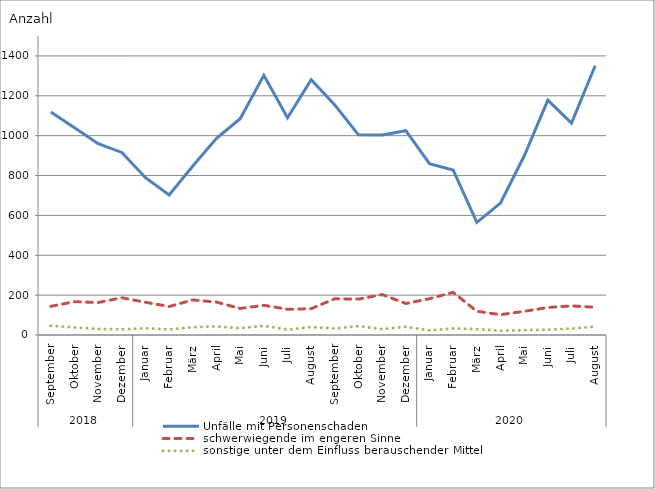
| Category | Unfälle mit Personenschaden | schwerwiegende im engeren Sinne | sonstige unter dem Einfluss berauschender Mittel |
|---|---|---|---|
| 0 | 1119 | 144 | 46 |
| 1 | 1040 | 167 | 38 |
| 2 | 960 | 163 | 30 |
| 3 | 916 | 187 | 28 |
| 4 | 789 | 164 | 34 |
| 5 | 702 | 143 | 28 |
| 6 | 848 | 176 | 39 |
| 7 | 987 | 165 | 43 |
| 8 | 1085 | 133 | 34 |
| 9 | 1303 | 149 | 46 |
| 10 | 1090 | 129 | 27 |
| 11 | 1281 | 132 | 40 |
| 12 | 1154 | 182 | 32 |
| 13 | 1004 | 180 | 45 |
| 14 | 1003 | 203 | 29 |
| 15 | 1025 | 158 | 41 |
| 16 | 860 | 182 | 23 |
| 17 | 828 | 214 | 33 |
| 18 | 565 | 119 | 29 |
| 19 | 662 | 102 | 22 |
| 20 | 898 | 119 | 24 |
| 21 | 1178 | 138 | 27 |
| 22 | 1063 | 146 | 32 |
| 23 | 1351 | 139 | 42 |